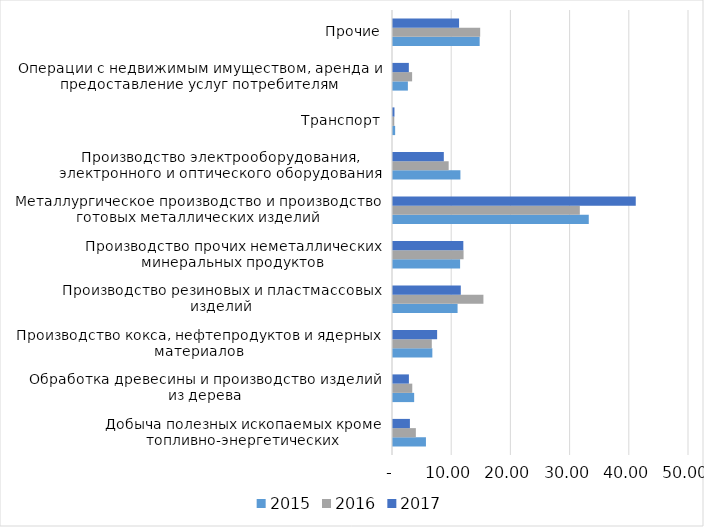
| Category | 2015 | 2016 | 2017 |
|---|---|---|---|
| Добыча полезных ископаемых кроме топливно-энергетических | 5.565 | 3.861 | 2.856 |
| Обработка древесины и производство изделий из дерева | 3.575 | 3.257 | 2.686 |
| Производство кокса, нефтепродуктов и ядерных материалов | 6.646 | 6.553 | 7.453 |
| Производство резиновых и пластмассовых изделий | 10.907 | 15.274 | 11.452 |
| Производство прочих неметаллических минеральных продуктов | 11.335 | 11.92 | 11.88 |
| Металлургическое производство и производство готовых металлических изделий | 33.069 | 31.559 | 41.007 |
| Производство электрооборудования, электронного и оптического оборудования | 11.388 | 9.404 | 8.583 |
| Транспорт | 0.363 | 0.215 | 0.247 |
| Операции с недвижимым имуществом, аренда и предоставление услуг потребителям | 2.513 | 3.229 | 2.676 |
| Прочие | 14.639 | 14.728 | 11.16 |